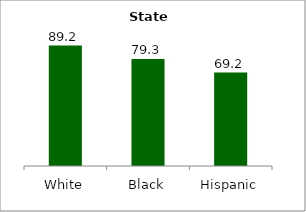
| Category | Series 0 |
|---|---|
| White | 89.203 |
| Black | 79.263 |
| Hispanic | 69.187 |